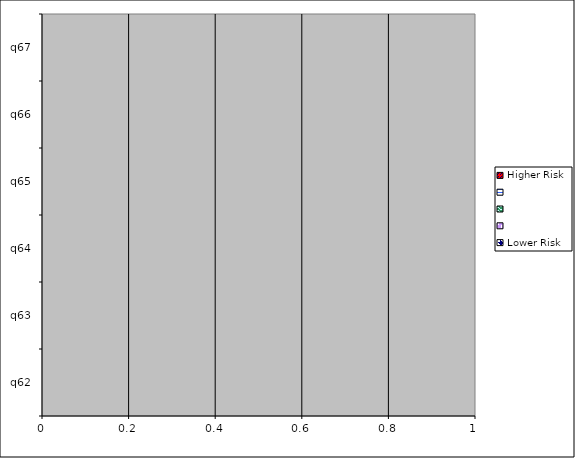
| Category | Higher Risk |   | Lower Risk |
|---|---|---|---|
| q62 | 0 | 0 | 0 |
| q63 | 0 | 0 | 0 |
| q64 | 0 | 0 | 0 |
| q65 | 0 | 0 | 0 |
| q66 | 0 | 0 | 0 |
| q67 | 0 | 0 | 0 |